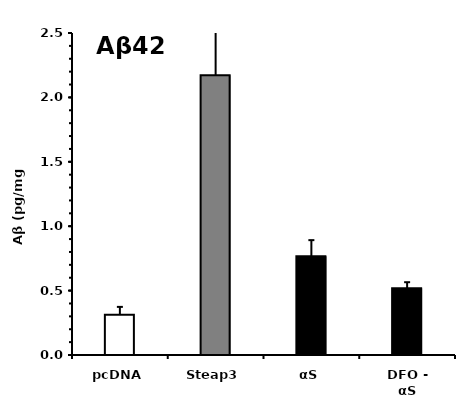
| Category | average |
|---|---|
| pcDNA | 0.312 |
| Steap3 | 2.172 |
| αS | 0.766 |
| DFO - αS | 0.519 |